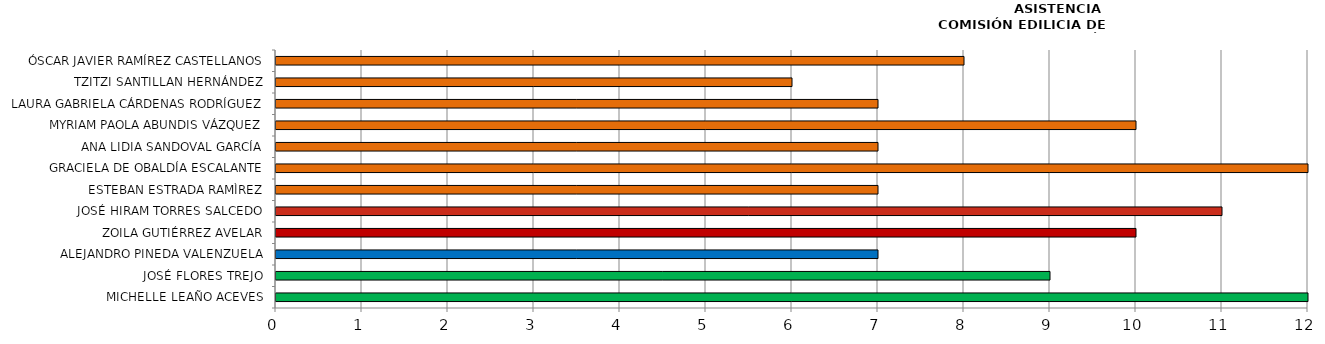
| Category | Series 0 |
|---|---|
| MICHELLE LEAÑO ACEVES | 12 |
| JOSÉ FLORES TREJO | 9 |
| ALEJANDRO PINEDA VALENZUELA | 7 |
| ZOILA GUTIÉRREZ AVELAR | 10 |
| JOSÉ HIRAM TORRES SALCEDO | 11 |
| ESTEBAN ESTRADA RAMÌREZ | 7 |
| GRACIELA DE OBALDÍA ESCALANTE | 12 |
| ANA LIDIA SANDOVAL GARCÍA | 7 |
| MYRIAM PAOLA ABUNDIS VÁZQUEZ | 10 |
| LAURA GABRIELA CÁRDENAS RODRÍGUEZ | 7 |
| TZITZI SANTILLAN HERNÁNDEZ | 6 |
| ÓSCAR JAVIER RAMÍREZ CASTELLANOS | 8 |